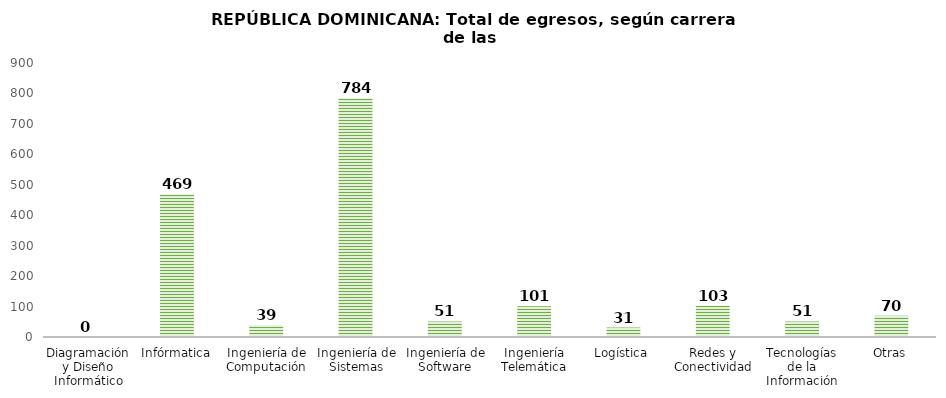
| Category | Series 0 |
|---|---|
| Diagramación y Diseño Informático | 0 |
| Infórmatica | 469 |
| Ingeniería de Computación | 39 |
| Ingeniería de Sistemas | 784 |
| Ingeniería de Software | 51 |
| Ingeniería Telemática | 101 |
| Logística | 31 |
| Redes y Conectividad | 103 |
| Tecnologías de la Información | 51 |
| Otras | 70 |